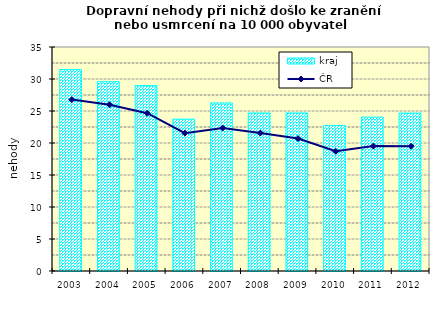
| Category | kraj |
|---|---|
| 2003.0 | 31.474 |
| 2004.0 | 29.58 |
| 2005.0 | 28.974 |
| 2006.0 | 23.727 |
| 2007.0 | 26.26 |
| 2008.0 | 24.692 |
| 2009.0 | 24.693 |
| 2010.0 | 22.73 |
| 2011.0 | 24.044 |
| 2012.0 | 24.671 |